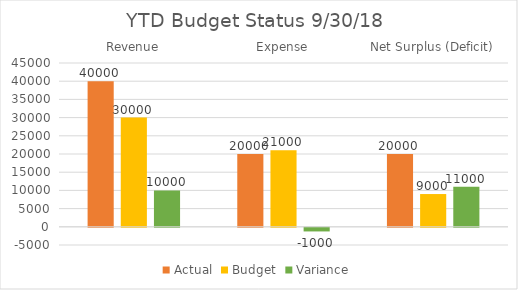
| Category | Actual | Budget | Variance |
|---|---|---|---|
| Revenue | 40000 | 30000 | 10000 |
| Expense | 20000 | 21000 | -1000 |
| Net Surplus (Deficit) | 20000 | 9000 | 11000 |